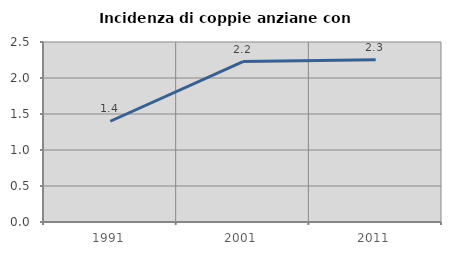
| Category | Incidenza di coppie anziane con figli |
|---|---|
| 1991.0 | 1.399 |
| 2001.0 | 2.228 |
| 2011.0 | 2.254 |